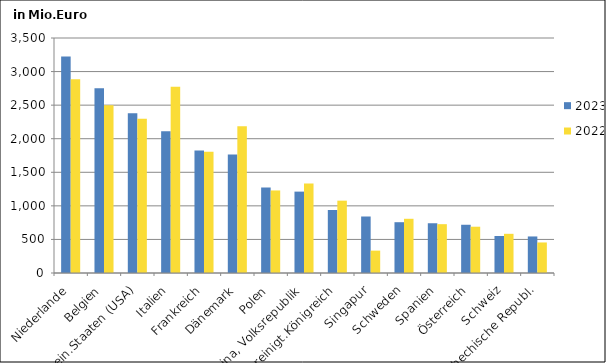
| Category | 2023 | 2022 |
|---|---|---|
| Niederlande | 3224.621 | 2886.854 |
| Belgien | 2751.954 | 2499.268 |
| Verein.Staaten (USA) | 2378.879 | 2297.574 |
| Italien | 2112.03 | 2774.294 |
| Frankreich | 1823.727 | 1806.905 |
| Dänemark | 1763.987 | 2185.54 |
| Polen | 1273.87 | 1229.371 |
| China, Volksrepublik | 1212.094 | 1331.762 |
| Vereinigt.Königreich | 938.32 | 1077.353 |
| Singapur | 841.553 | 333.26 |
| Schweden | 756.551 | 807.37 |
| Spanien | 740.967 | 727.273 |
| Österreich | 718.479 | 689.347 |
| Schweiz | 551.513 | 583.596 |
| Tschechische Republ. | 544.268 | 454.77 |